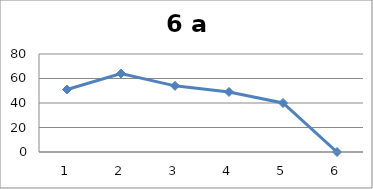
| Category | Series 0 |
|---|---|
| 0 | 51 |
| 1 | 64 |
| 2 | 54 |
| 3 | 49 |
| 4 | 40 |
| 5 | 0 |